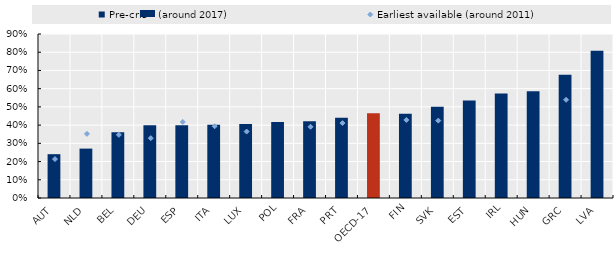
| Category | Pre-crisis (around 2017) |
|---|---|
| AUT | 0.24 |
| NLD | 0.271 |
| BEL | 0.361 |
| DEU | 0.399 |
| ESP | 0.399 |
| ITA | 0.402 |
| LUX | 0.406 |
| POL | 0.417 |
| FRA | 0.421 |
| PRT | 0.441 |
| OECD-17 | 0.465 |
| FIN | 0.462 |
| SVK | 0.501 |
| EST | 0.535 |
| IRL | 0.573 |
| HUN | 0.586 |
| GRC | 0.676 |
| LVA | 0.808 |